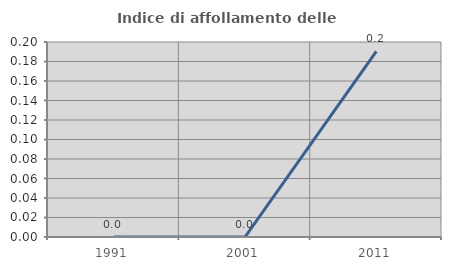
| Category | Indice di affollamento delle abitazioni  |
|---|---|
| 1991.0 | 0 |
| 2001.0 | 0 |
| 2011.0 | 0.19 |